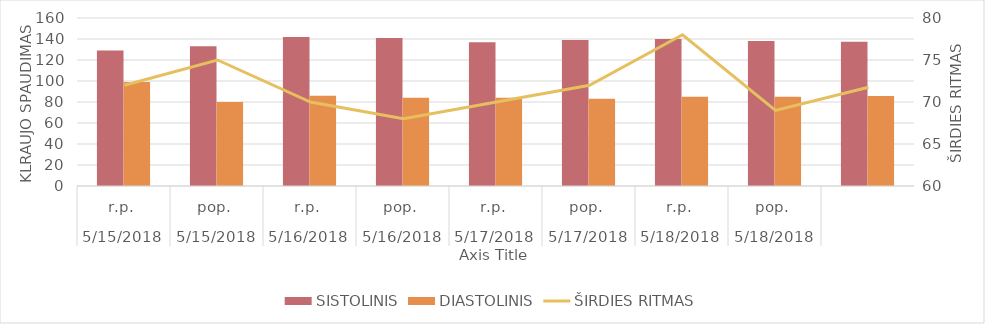
| Category | SISTOLINIS | DIASTOLINIS |
|---|---|---|
| 0 | 129 | 99 |
| 1/1/00 | 133 | 80 |
| 1/2/00 | 142 | 86 |
| 1/3/00 | 141 | 84 |
| 1/4/00 | 137 | 84 |
| 1/5/00 | 139 | 83 |
| 1/6/00 | 140 | 85 |
| 1/7/00 | 138 | 85 |